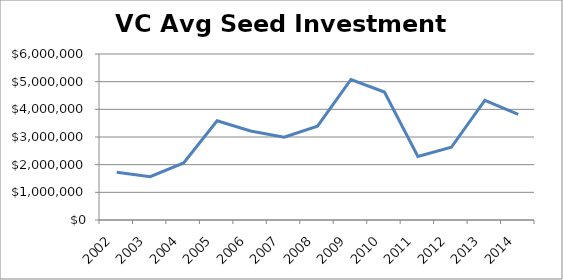
| Category | Series 0 |
|---|---|
| 2002.0 | 1724719.101 |
| 2003.0 | 1564593.301 |
| 2004.0 | 2062780.269 |
| 2005.0 | 3583657.588 |
| 2006.0 | 3216494.845 |
| 2007.0 | 2989979.96 |
| 2008.0 | 3392578.125 |
| 2009.0 | 5079096.045 |
| 2010.0 | 4624664.879 |
| 2011.0 | 2297500 |
| 2012.0 | 2628975.265 |
| 2013.0 | 4325688.073 |
| 2014.0 | 3815384.615 |